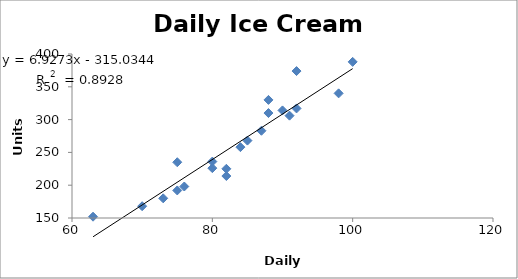
| Category | Series 0 |
|---|---|
| 63.0 | 152 |
| 70.0 | 168 |
| 73.0 | 180 |
| 75.0 | 235 |
| 80.0 | 236 |
| 82.0 | 225 |
| 85.0 | 268 |
| 88.0 | 330 |
| 90.0 | 314 |
| 91.0 | 306 |
| 92.0 | 374 |
| 75.0 | 192 |
| 98.0 | 340 |
| 100.0 | 388 |
| 92.0 | 317 |
| 87.0 | 283 |
| 84.0 | 258 |
| 88.0 | 310 |
| 80.0 | 226 |
| 82.0 | 214 |
| 76.0 | 198 |